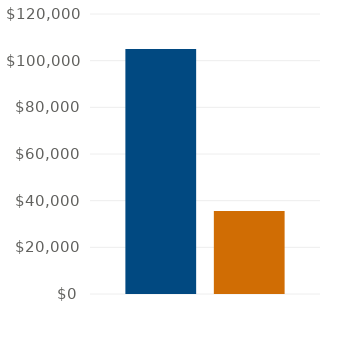
| Category | Income | Expenses |
|---|---|---|
| 0 | 105000 | 35528.1 |